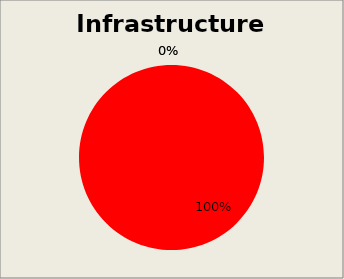
| Category | Series 6 |
|---|---|
| 0 | 0 |
| 1 | 13 |
| 2 | 0 |